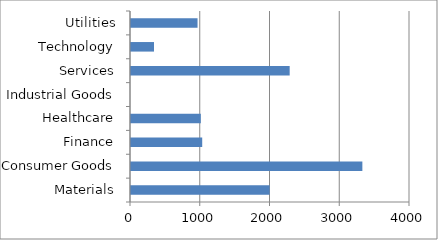
| Category | Series 0 |
|---|---|
| Materials | 1988 |
| Consumer Goods | 3317 |
| Finance | 1021 |
| Healthcare | 1001 |
| Industrial Goods | 0 |
| Services | 2275 |
| Technology | 330 |
| Utilities | 954 |